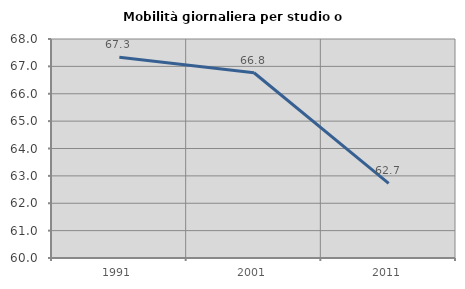
| Category | Mobilità giornaliera per studio o lavoro |
|---|---|
| 1991.0 | 67.331 |
| 2001.0 | 66.766 |
| 2011.0 | 62.724 |